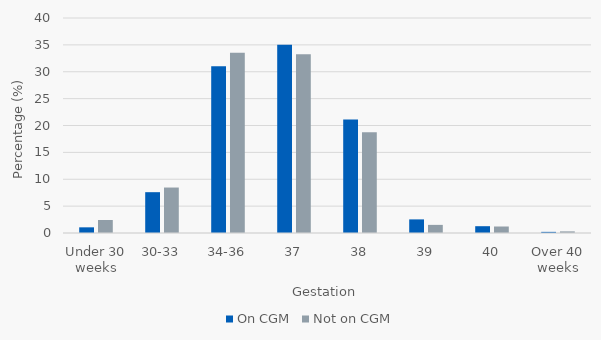
| Category | On CGM | Not on CGM |
|---|---|---|
| Under 30 weeks | 1.055 | 2.417 |
| 30-33 | 7.595 | 8.459 |
| 34-36 | 31.013 | 33.535 |
| 37 | 35.021 | 33.233 |
| 38 | 21.097 | 18.731 |
| 39 | 2.532 | 1.511 |
| 40 | 1.266 | 1.208 |
| Over 40 weeks | 0.211 | 0.302 |